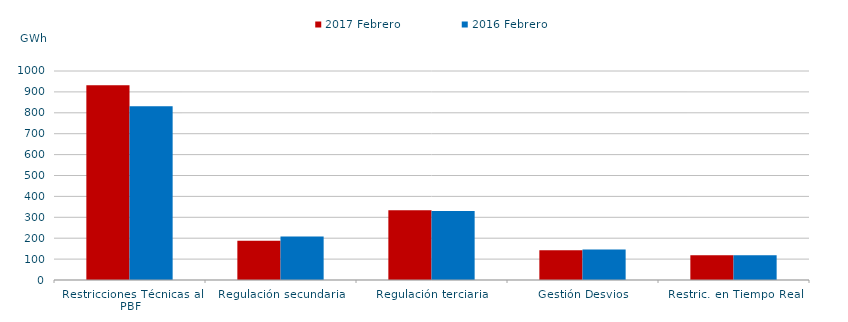
| Category | 2017 | 2016 |
|---|---|---|
| Restricciones Técnicas al PBF | 931.503 | 830.756 |
| Regulación secundaria | 188.122 | 207.928 |
| Regulación terciaria | 334.301 | 329.945 |
| Gestión Desvios | 142.445 | 145.528 |
| Restric. en Tiempo Real | 118.37 | 117.895 |